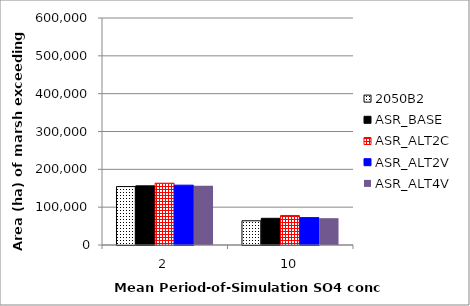
| Category | 2050B2 | ASR_BASE | ASR_ALT2C | ASR_ALT2V | ASR_ALT4V |
|---|---|---|---|---|---|
| 2.0 | 154450 | 156350 | 163300 | 158175 | 156775 |
| 10.0 | 64000 | 70575 | 78025 | 72400 | 70900 |